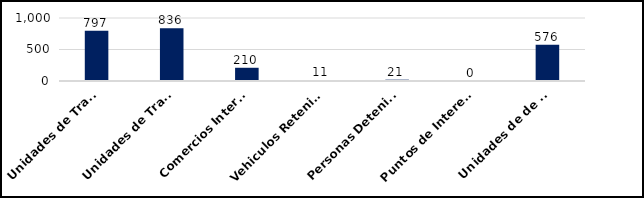
| Category | Series 0 |
|---|---|
| Unidades de Transporte de Combustibles Inspeccionados | 797 |
| Unidades de Transporte de Mercancias Inspeccionadas | 836 |
| Comercios Intervenidos | 210 |
| Vehiculos Retenidos  | 11 |
| Personas Detenidas | 21 |
| Puntos de Interes intervenidos | 0 |
| Unidades de de Transporte Desechos Oleosos Inspeccionadas  | 576 |